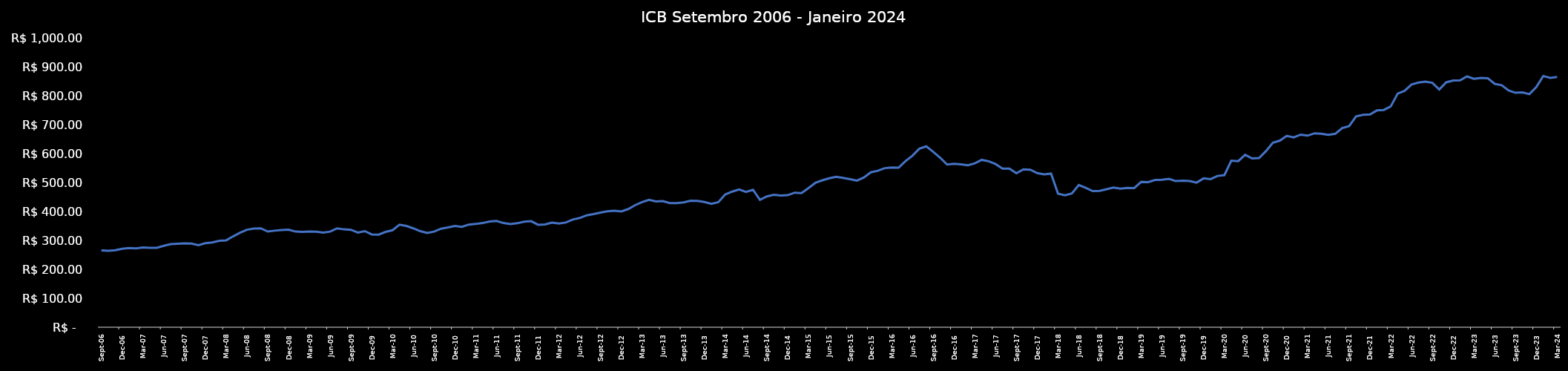
| Category | Series 0 |
|---|---|
| 2006-09-01 | 266.13 |
| 2006-10-01 | 264.48 |
| 2006-11-01 | 266.81 |
| 2006-12-01 | 271.95 |
| 2007-01-01 | 274.14 |
| 2007-02-01 | 273.32 |
| 2007-03-01 | 276.41 |
| 2007-04-01 | 275.3 |
| 2007-05-01 | 275.06 |
| 2007-06-01 | 282.26 |
| 2007-07-01 | 287.86 |
| 2007-08-01 | 289.22 |
| 2007-09-01 | 290.35 |
| 2007-10-01 | 290.04 |
| 2007-11-01 | 284.21 |
| 2007-12-01 | 291.29 |
| 2008-01-01 | 293.95 |
| 2008-02-01 | 299.35 |
| 2008-03-01 | 300.97 |
| 2008-04-01 | 314.73 |
| 2008-05-01 | 327.36 |
| 2008-06-01 | 337.84 |
| 2008-07-01 | 341.93 |
| 2008-08-01 | 342.68 |
| 2008-09-01 | 331.51 |
| 2008-10-01 | 334.5 |
| 2008-11-01 | 336.61 |
| 2008-12-01 | 338.08 |
| 2009-01-01 | 331.42 |
| 2009-02-01 | 330.35 |
| 2009-03-01 | 331.48 |
| 2009-04-01 | 331.05 |
| 2009-05-01 | 327.62 |
| 2009-06-01 | 331.25 |
| 2009-07-01 | 342.65 |
| 2009-08-01 | 339.02 |
| 2009-09-01 | 337.48 |
| 2009-10-01 | 327.75 |
| 2009-11-01 | 332.94 |
| 2009-12-01 | 321.55 |
| 2010-01-01 | 320.83 |
| 2010-02-01 | 330.26 |
| 2010-03-01 | 336.06 |
| 2010-04-01 | 355.08 |
| 2010-05-01 | 350.85 |
| 2010-06-01 | 342.64 |
| 2010-07-01 | 332.82 |
| 2010-08-01 | 326.69 |
| 2010-09-01 | 331.22 |
| 2010-10-01 | 341.47 |
| 2010-11-01 | 345.56 |
| 2010-12-01 | 350.59 |
| 2011-01-01 | 347.78 |
| 2011-02-01 | 355.63 |
| 2011-03-01 | 357.67 |
| 2011-04-01 | 360.94 |
| 2011-05-01 | 366.29 |
| 2011-06-01 | 367.94 |
| 2011-07-01 | 361.01 |
| 2011-08-01 | 357.32 |
| 2011-09-01 | 360.3 |
| 2011-10-01 | 365.87 |
| 2011-11-01 | 367.34 |
| 2011-12-01 | 354.94 |
| 2012-01-01 | 356.1 |
| 2012-02-01 | 362.36 |
| 2012-03-01 | 359.41 |
| 2012-04-01 | 362.71 |
| 2012-05-01 | 373.23 |
| 2012-06-01 | 378.31 |
| 2012-07-01 | 387.73 |
| 2012-08-01 | 391.81 |
| 2012-09-01 | 397.3 |
| 2012-10-01 | 401.41 |
| 2012-11-01 | 403.77 |
| 2012-12-01 | 401.17 |
| 2013-01-01 | 409.35 |
| 2013-02-01 | 422.91 |
| 2013-03-01 | 433.63 |
| 2013-04-01 | 441.59 |
| 2013-05-01 | 436.04 |
| 2013-06-01 | 436.78 |
| 2013-07-01 | 430.13 |
| 2013-08-01 | 430.22 |
| 2013-09-01 | 432.67 |
| 2013-10-01 | 438.39 |
| 2013-11-01 | 437.92 |
| 2013-12-01 | 433.57 |
| 2014-01-01 | 427.67 |
| 2014-02-01 | 433.36 |
| 2014-03-01 | 459.98 |
| 2014-04-01 | 469.89 |
| 2014-05-01 | 477.14 |
| 2014-06-01 | 468.76 |
| 2014-07-01 | 476.28 |
| 2014-08-01 | 441.03 |
| 2014-09-01 | 453.06 |
| 2014-10-01 | 458.91 |
| 2014-11-01 | 456.59 |
| 2014-12-01 | 457.42 |
| 2015-01-01 | 466.22 |
| 2015-02-01 | 464.85 |
| 2015-03-01 | 482.2 |
| 2015-04-01 | 500.14 |
| 2015-05-01 | 508.91 |
| 2015-06-01 | 516.22 |
| 2015-07-01 | 521.16 |
| 2015-08-01 | 517.4 |
| 2015-09-01 | 512.64 |
| 2015-10-01 | 508.07 |
| 2015-11-01 | 518.93 |
| 2015-12-01 | 536.67 |
| 2016-01-01 | 542.07 |
| 2016-02-01 | 551.1 |
| 2016-03-01 | 553.2 |
| 2016-04-01 | 552.57 |
| 2016-05-01 | 575.49 |
| 2016-06-01 | 594.25 |
| 2016-07-01 | 618.48 |
| 2016-08-01 | 626.51 |
| 2016-09-01 | 607.7 |
| 2016-10-01 | 587.42 |
| 2016-11-01 | 563.66 |
| 2016-12-01 | 566.46 |
| 2017-01-01 | 564.14 |
| 2017-02-01 | 560.94 |
| 2017-03-01 | 567.93 |
| 2017-04-01 | 579.83 |
| 2017-05-01 | 574.93 |
| 2017-06-01 | 565.22 |
| 2017-07-01 | 549.58 |
| 2017-08-01 | 549.39 |
| 2017-09-01 | 533.29 |
| 2017-10-01 | 547.01 |
| 2017-11-01 | 545.88 |
| 2017-12-01 | 534.11 |
| 2018-01-01 | 529.62 |
| 2018-02-01 | 532.2 |
| 2018-03-01 | 462.65 |
| 2018-04-01 | 457.12 |
| 2018-05-01 | 463.59 |
| 2018-06-01 | 492.89 |
| 2018-07-01 | 482.8 |
| 2018-08-01 | 471.46 |
| 2018-09-01 | 472.582 |
| 2018-10-01 | 478.034 |
| 2018-11-01 | 483.743 |
| 2018-12-01 | 480.132 |
| 2019-01-01 | 482.726 |
| 2019-02-01 | 482.311 |
| 2019-03-01 | 503.746 |
| 2019-04-01 | 502.877 |
| 2019-05-01 | 510.203 |
| 2019-06-01 | 510.779 |
| 2019-07-01 | 513.81 |
| 2019-08-01 | 506.2 |
| 2019-09-01 | 507.63 |
| 2019-10-01 | 506.59 |
| 2019-11-01 | 501.05 |
| 2019-12-01 | 515.78 |
| 2020-01-01 | 512.99 |
| 2020-02-01 | 524.12 |
| 2020-03-01 | 527.03 |
| 2020-04-01 | 577.06 |
| 2020-05-01 | 575.47 |
| 2020-06-01 | 597.48 |
| 2020-07-01 | 584.69 |
| 2020-08-01 | 585.92 |
| 2020-09-01 | 610.17 |
| 2020-10-01 | 639.3 |
| 2020-11-01 | 646.5 |
| 2020-12-01 | 663.08 |
| 2021-01-01 | 657.48 |
| 2021-02-01 | 667.18 |
| 2021-03-01 | 663.67 |
| 2021-04-01 | 671.84 |
| 2021-05-01 | 670.39 |
| 2021-06-01 | 666.43 |
| 2021-07-01 | 670.16 |
| 2021-08-01 | 690.18 |
| 2021-09-01 | 697.07 |
| 2021-10-01 | 730.57 |
| 2021-11-01 | 735.97 |
| 2021-12-01 | 736.95 |
| 2022-01-01 | 751.04 |
| 2022-02-01 | 752.73 |
| 2022-03-01 | 765.03 |
| 2022-04-01 | 809.59 |
| 2022-05-01 | 819.12 |
| 2022-06-01 | 840.89 |
| 2022-07-01 | 847.65 |
| 2022-08-01 | 850.78 |
| 2022-09-01 | 846.73 |
| 2022-10-01 | 823.53 |
| 2022-11-01 | 848.42 |
| 2022-12-01 | 854.8 |
| 2023-01-01 | 855.5 |
| 2023-02-01 | 868.95 |
| 2023-03-01 | 860.86 |
| 2023-04-01 | 863.81 |
| 2023-05-01 | 862.73 |
| 2023-06-01 | 843.15 |
| 2023-07-01 | 838.49 |
| 2023-08-01 | 820.44 |
| 2023-09-01 | 812.16 |
| 2023-10-01 | 813.58 |
| 2023-11-01 | 807.43 |
| 2023-12-01 | 831.87 |
| 2024-01-01 | 870.5 |
| 2024-02-01 | 863.97 |
| 2024-03-01 | 866.77 |